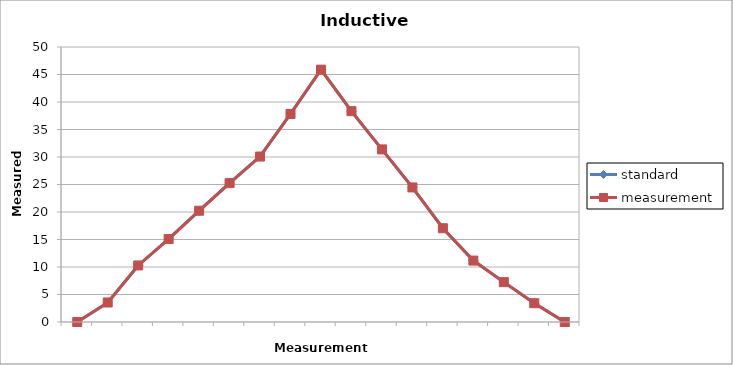
| Category | standard | measurement |
|---|---|---|
|  | 0 | 0 |